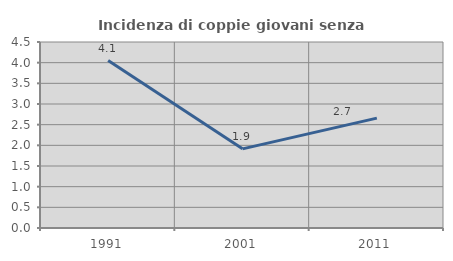
| Category | Incidenza di coppie giovani senza figli |
|---|---|
| 1991.0 | 4.052 |
| 2001.0 | 1.915 |
| 2011.0 | 2.659 |